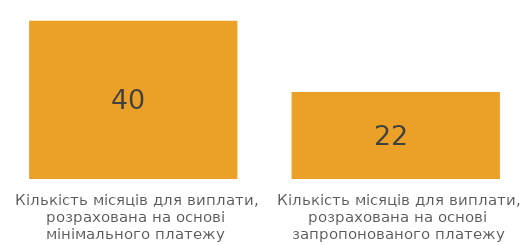
| Category | Series 0 |
|---|---|
| Кількість місяців для виплати, розрахована на основі мінімального платежу | 40 |
| Кількість місяців для виплати, розрахована на основі запропонованого платежу | 22 |